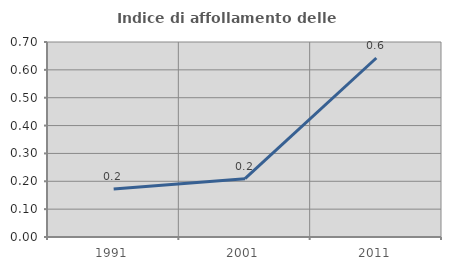
| Category | Indice di affollamento delle abitazioni  |
|---|---|
| 1991.0 | 0.172 |
| 2001.0 | 0.209 |
| 2011.0 | 0.642 |